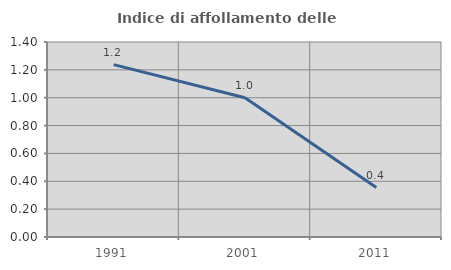
| Category | Indice di affollamento delle abitazioni  |
|---|---|
| 1991.0 | 1.237 |
| 2001.0 | 0.999 |
| 2011.0 | 0.355 |